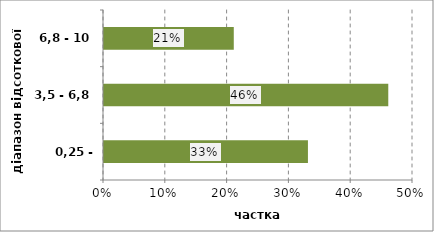
| Category | Series 0 |
|---|---|
| 0,25 - 3,5 | 0.33 |
| 3,5 - 6,8 | 0.46 |
| 6,8 - 10 | 0.21 |